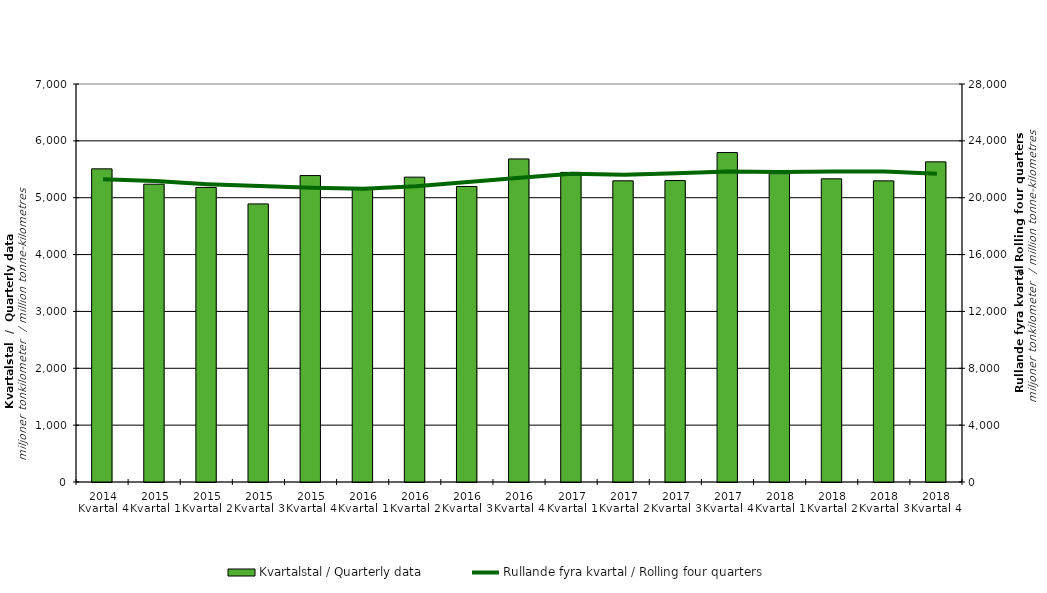
| Category | Kvartalstal / Quarterly data |
|---|---|
| 2014 Kvartal 4 | 5507.547 |
| 2015 Kvartal 1 | 5237.851 |
| 2015 Kvartal 2 | 5180.999 |
| 2015 Kvartal 3 | 4890.93 |
| 2015 Kvartal 4 | 5389.537 |
| 2016 Kvartal 1 | 5165.494 |
| 2016 Kvartal 2 | 5361.561 |
| 2016 Kvartal 3 | 5197.015 |
| 2016 Kvartal 4 | 5681.686 |
| 2017 Kvartal 1 | 5444.853 |
| 2017 Kvartal 2 | 5297.279 |
| 2017 Kvartal 3 | 5301.875 |
| 2017 Kvartal 4 | 5794.168 |
| 2018 Kvartal 1 | 5423.263 |
| 2018 Kvartal 2 | 5331.905 |
| 2018 Kvartal 3 | 5296.656 |
| 2018 Kvartal 4 | 5630.579 |